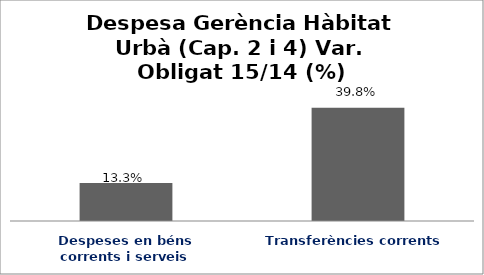
| Category | Series 0 |
|---|---|
| Despeses en béns corrents i serveis | 0.133 |
| Transferències corrents | 0.398 |